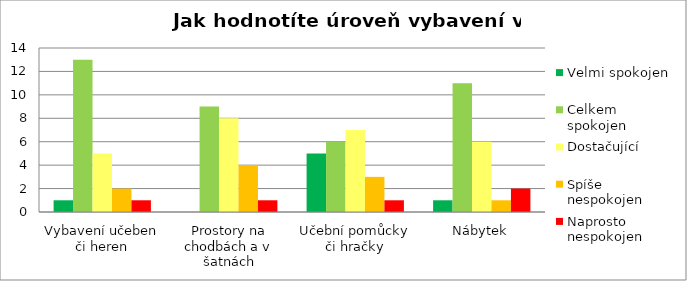
| Category | Velmi spokojen | Celkem 
spokojen | Dostačující | Spíše 
nespokojen | Naprosto 
nespokojen |
|---|---|---|---|---|---|
| Vybavení učeben či heren | 1 | 13 | 5 | 2 | 1 |
| Prostory na chodbách a v šatnách | 0 | 9 | 8 | 4 | 1 |
| Učební pomůcky či hračky | 5 | 6 | 7 | 3 | 1 |
| Nábytek | 1 | 11 | 6 | 1 | 2 |